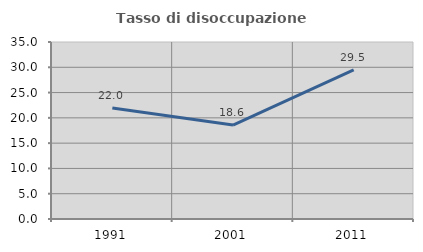
| Category | Tasso di disoccupazione giovanile  |
|---|---|
| 1991.0 | 21.962 |
| 2001.0 | 18.566 |
| 2011.0 | 29.487 |